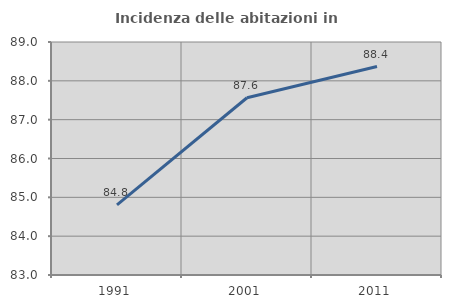
| Category | Incidenza delle abitazioni in proprietà  |
|---|---|
| 1991.0 | 84.808 |
| 2001.0 | 87.565 |
| 2011.0 | 88.369 |